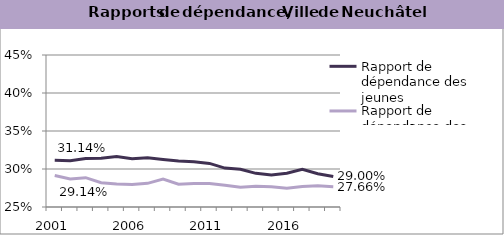
| Category | Rapport de dépendance des jeunes | Rapport de dépendance des personnes âgées |
|---|---|---|
| 2001.0 | 0.311 | 0.291 |
| 2002.0 | 0.311 | 0.287 |
| 2003.0 | 0.314 | 0.289 |
| 2004.0 | 0.314 | 0.282 |
| 2005.0 | 0.316 | 0.28 |
| 2006.0 | 0.314 | 0.28 |
| 2007.0 | 0.315 | 0.281 |
| 2008.0 | 0.313 | 0.287 |
| 2009.0 | 0.311 | 0.28 |
| 2010.0 | 0.31 | 0.281 |
| 2011.0 | 0.307 | 0.281 |
| 2012.0 | 0.301 | 0.279 |
| 2013.0 | 0.3 | 0.276 |
| 2014.0 | 0.294 | 0.277 |
| 2015.0 | 0.292 | 0.277 |
| 2016.0 | 0.294 | 0.275 |
| 2017.0 | 0.3 | 0.277 |
| 2018.0 | 0.294 | 0.278 |
| 2019.0 | 0.29 | 0.277 |